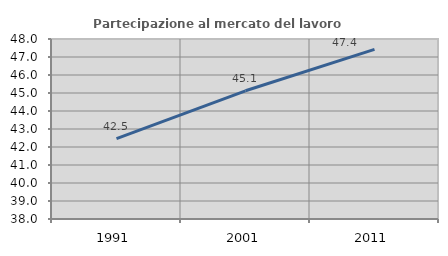
| Category | Partecipazione al mercato del lavoro  femminile |
|---|---|
| 1991.0 | 42.46 |
| 2001.0 | 45.123 |
| 2011.0 | 47.421 |